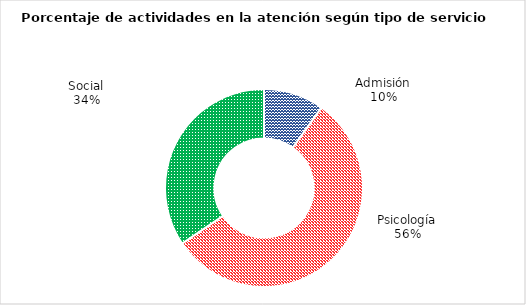
| Category | Series 0 |
|---|---|
| Admisión | 0.099 |
| Psicología | 0.556 |
| Social | 0.345 |